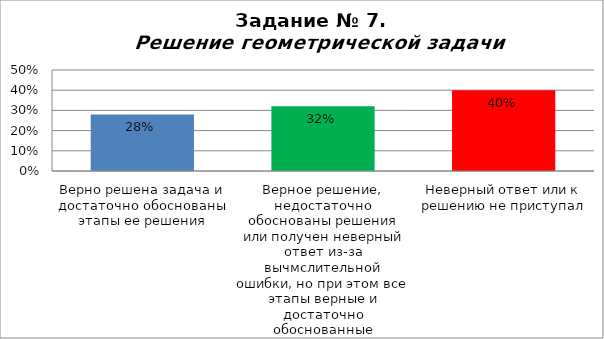
| Category | Решение геометрической задачи  |
|---|---|
| Верно решена задача и достаточно обоснованы этапы ее решения | 0.28 |
| Верное решение, недостаточно обоснованы решения или получен неверный ответ из-за вычмслительной ошибки, но при этом все этапы верные и достаточно обоснованные | 0.32 |
| Неверный ответ или к решению не приступал | 0.4 |